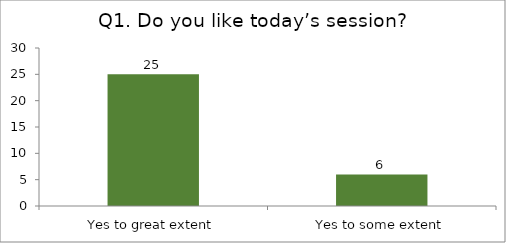
| Category | Q1. Do you like today’s session? |
|---|---|
| Yes to great extent | 25 |
| Yes to some extent | 6 |